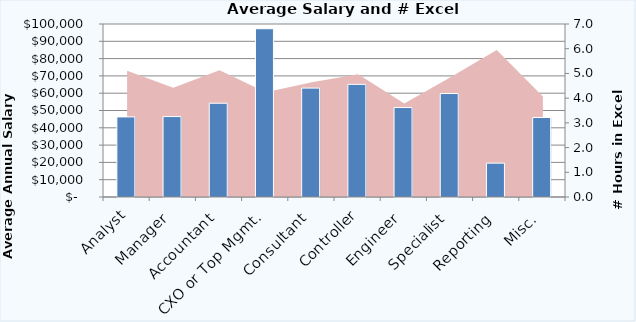
| Category | Average Salary |
|---|---|
| Analyst | 46295.769 |
| Manager | 46488.241 |
| Accountant | 54196.441 |
| CXO or Top Mgmt. | 97265.876 |
| Consultant | 62950.733 |
| Controller | 65103.929 |
| Engineer | 51715.151 |
| Specialist | 59812.969 |
| Reporting | 19574.159 |
| Misc. | 45952.334 |